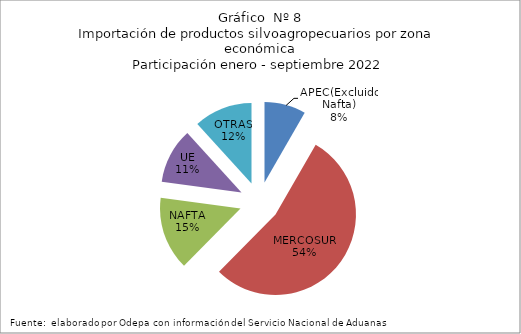
| Category | Series 0 |
|---|---|
| APEC(Excluido Nafta) | 609142.47 |
| MERCOSUR | 3958573.642 |
| NAFTA | 1079369.4 |
| UE | 814746.132 |
| OTRAS | 860359.356 |